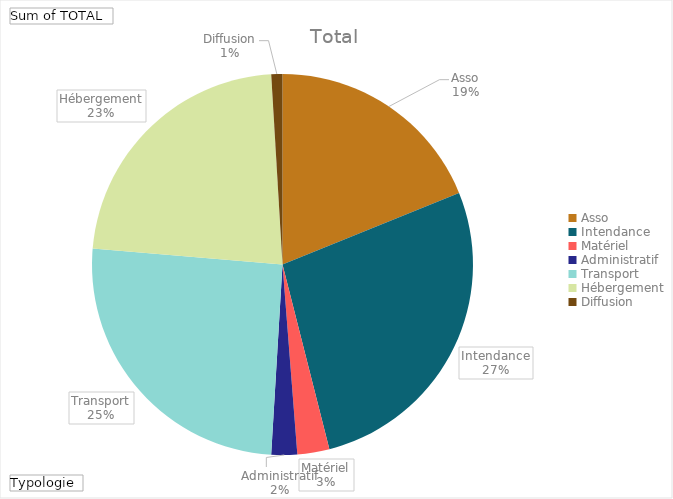
| Category | Total |
|---|---|
| Asso | 2500 |
| Intendance | 3600 |
| Matériel | 360 |
| Administratif | 290 |
| Transport | 3364 |
| Hébergement | 3010 |
| Diffusion | 125 |